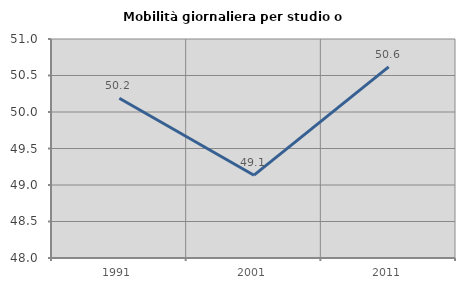
| Category | Mobilità giornaliera per studio o lavoro |
|---|---|
| 1991.0 | 50.189 |
| 2001.0 | 49.135 |
| 2011.0 | 50.618 |